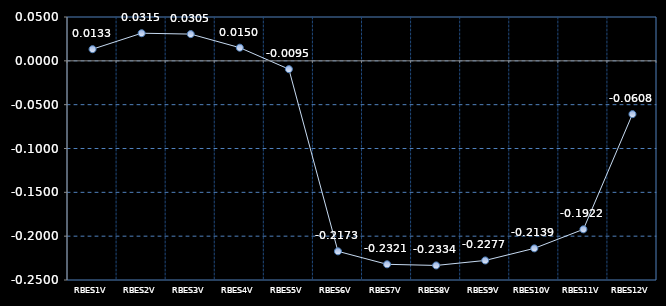
| Category | Series 0 |
|---|---|
| RBES1V | 0.013 |
| RBES2V | 0.032 |
| RBES3V | 0.031 |
| RBES4V | 0.015 |
| RBES5V | -0.01 |
| RBES6V | -0.217 |
| RBES7V | -0.232 |
| RBES8V | -0.233 |
| RBES9V | -0.228 |
| RBES10V | -0.214 |
| RBES11V | -0.192 |
| RBES12V | -0.061 |